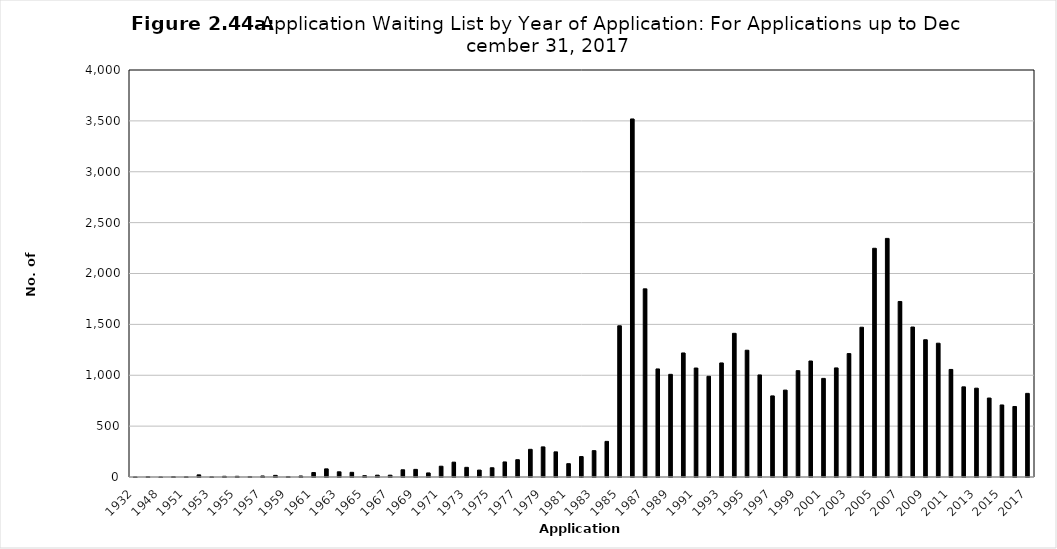
| Category | Series 0 |
|---|---|
| 1932.0 | 1 |
| 1947.0 | 4 |
| 1948.0 | 1 |
| 1950.0 | 4 |
| 1951.0 | 3 |
| 1952.0 | 21 |
| 1953.0 | 2 |
| 1954.0 | 7 |
| 1955.0 | 7 |
| 1956.0 | 5 |
| 1957.0 | 10 |
| 1958.0 | 16 |
| 1959.0 | 5 |
| 1960.0 | 10 |
| 1961.0 | 44 |
| 1962.0 | 80 |
| 1963.0 | 51 |
| 1964.0 | 46 |
| 1965.0 | 13 |
| 1966.0 | 18 |
| 1967.0 | 18 |
| 1968.0 | 71 |
| 1969.0 | 75 |
| 1970.0 | 40 |
| 1971.0 | 106 |
| 1972.0 | 146 |
| 1973.0 | 95 |
| 1974.0 | 68 |
| 1975.0 | 91 |
| 1976.0 | 148 |
| 1977.0 | 170 |
| 1978.0 | 272 |
| 1979.0 | 296 |
| 1980.0 | 247 |
| 1981.0 | 131 |
| 1982.0 | 201 |
| 1983.0 | 259 |
| 1984.0 | 350 |
| 1985.0 | 1486 |
| 1986.0 | 3519 |
| 1987.0 | 1849 |
| 1988.0 | 1062 |
| 1989.0 | 1009 |
| 1990.0 | 1219 |
| 1991.0 | 1071 |
| 1992.0 | 990 |
| 1993.0 | 1121 |
| 1994.0 | 1412 |
| 1995.0 | 1246 |
| 1996.0 | 1003 |
| 1997.0 | 797 |
| 1998.0 | 854 |
| 1999.0 | 1045 |
| 2000.0 | 1140 |
| 2001.0 | 969 |
| 2002.0 | 1072 |
| 2003.0 | 1213 |
| 2004.0 | 1472 |
| 2005.0 | 2248 |
| 2006.0 | 2345 |
| 2007.0 | 1725 |
| 2008.0 | 1474 |
| 2009.0 | 1349 |
| 2010.0 | 1315 |
| 2011.0 | 1057 |
| 2012.0 | 886 |
| 2013.0 | 873 |
| 2014.0 | 776 |
| 2015.0 | 708 |
| 2016.0 | 693 |
| 2017.0 | 822 |